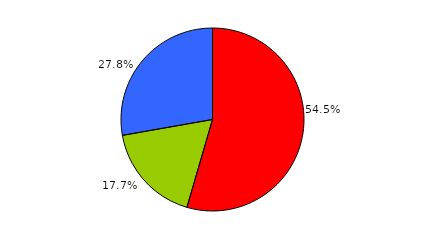
| Category | Series 0 |
|---|---|
| 0 | 157 |
| 1 | 51 |
| 2 | 80 |